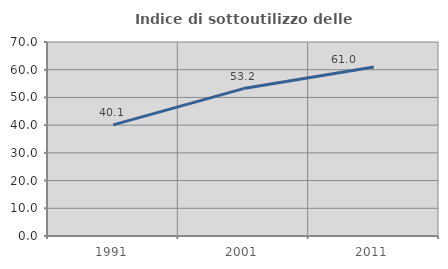
| Category | Indice di sottoutilizzo delle abitazioni  |
|---|---|
| 1991.0 | 40.102 |
| 2001.0 | 53.191 |
| 2011.0 | 60.989 |